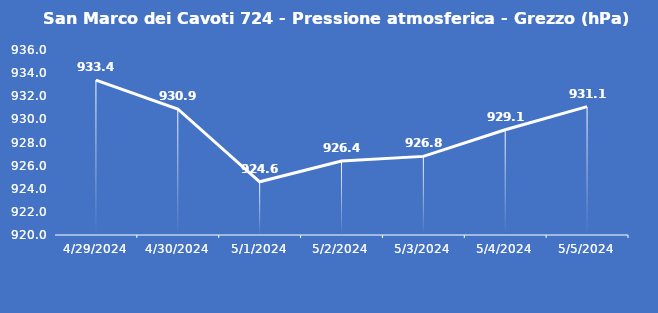
| Category | San Marco dei Cavoti 724 - Pressione atmosferica - Grezzo (hPa) |
|---|---|
| 4/29/24 | 933.4 |
| 4/30/24 | 930.9 |
| 5/1/24 | 924.6 |
| 5/2/24 | 926.4 |
| 5/3/24 | 926.8 |
| 5/4/24 | 929.1 |
| 5/5/24 | 931.1 |